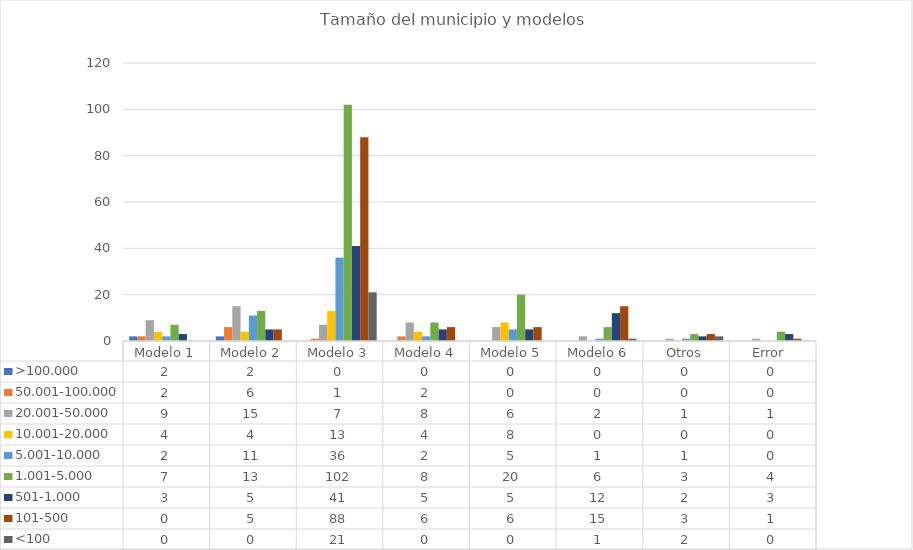
| Category | >100.000 | 50.001-100.000 | 20.001-50.000 | 10.001-20.000 | 5.001-10.000 | 1.001-5.000 | 501-1.000 | 101-500 | <100 |
|---|---|---|---|---|---|---|---|---|---|
| Modelo 1 | 2 | 2 | 9 | 4 | 2 | 7 | 3 | 0 | 0 |
| Modelo 2 | 2 | 6 | 15 | 4 | 11 | 13 | 5 | 5 | 0 |
| Modelo 3 | 0 | 1 | 7 | 13 | 36 | 102 | 41 | 88 | 21 |
| Modelo 4 | 0 | 2 | 8 | 4 | 2 | 8 | 5 | 6 | 0 |
| Modelo 5 | 0 | 0 | 6 | 8 | 5 | 20 | 5 | 6 | 0 |
| Modelo 6 | 0 | 0 | 2 | 0 | 1 | 6 | 12 | 15 | 1 |
| Otros | 0 | 0 | 1 | 0 | 1 | 3 | 2 | 3 | 2 |
| Error  | 0 | 0 | 1 | 0 | 0 | 4 | 3 | 1 | 0 |